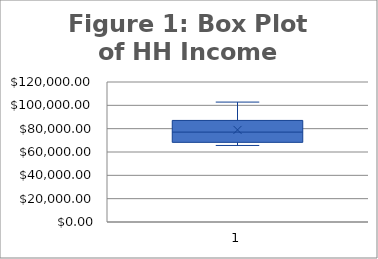
| Category | HH Income |
|---|---|
| Montreal | 77599 |
| Laval  | 84818 |
| Longueuil  | 89285 |
| Le Haut-Saint-Laurent | 66769 |
| Les Jardins-de-Napierville | 66345 |
| Le Haut-Richelieu | 76888 |
| Brome-Missisquoi | 77062 |
| Memphremagog | 78902 |
| Coaticook | 65604 |
| Sherbrooke | 68266 |
| Beauharnois-Salaberry | 66923 |
| Roussillon | 94341 |
| Rouville | 76415 |
| La Haute-Yamaska | 70930 |
| Le Val-Saint Francois | 73517 |
| La Vallée-du-Richelieu | 102781 |
| Vaudreuil-Soulange | 92530 |
| Deux-Montagnes | 83793 |
| Mirabel | 87059 |